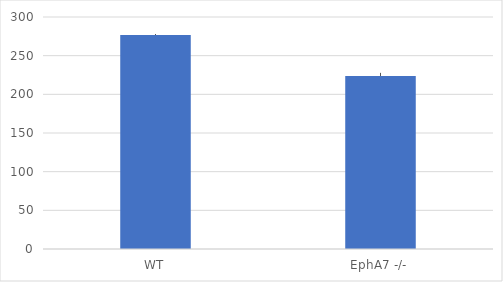
| Category | Series 0 |
|---|---|
| WT | 276.667 |
| EphA7 -/- | 223.667 |